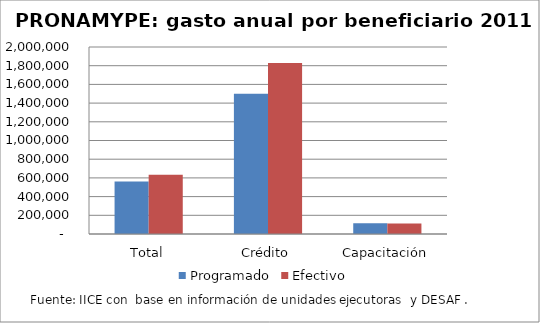
| Category | Programado | Efectivo |
|---|---|---|
| Total | 561169.183 | 634254.893 |
| Crédito | 1500000 | 1829538.242 |
| Capacitación | 114285.714 | 111682.719 |